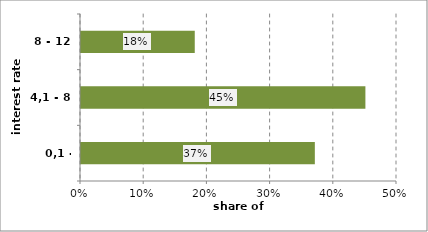
| Category | Series 0 |
|---|---|
| 0,1 - 4,1 | 0.37 |
| 4,1 - 8 | 0.45 |
| 8 - 12 | 0.18 |